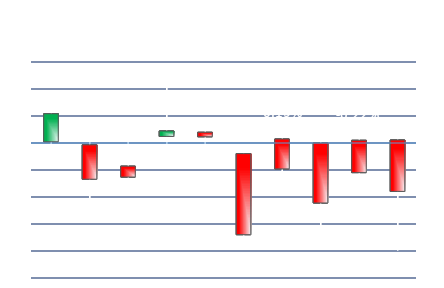
| Category | Series 0 | Series 1 | Series 2 | Series 3 |
|---|---|---|---|---|
| DXEZ19 | 0 | 0.004 | -0.001 | 0.002 |
| EU6Z19 | 0 | 0.001 | -0.005 | -0.003 |
| JY6Z19 | -0.002 | 0.001 | -0.003 | -0.003 |
| BP6Z19 | 0 | 0.005 | -0.001 | 0.001 |
| CA6Z19 | 0.001 | 0.002 | -0.001 | 0 |
| SF6Z19 | -0.001 | 0 | -0.008 | -0.007 |
| DA6Z19 | 0 | 0.001 | -0.003 | -0.002 |
| NE6Z19 | 0 | 0.001 | -0.007 | -0.004 |
| MX6Z19 | 0 | 0.001 | -0.003 | -0.002 |
| EBZ19 | 0 | 0 | -0.008 | -0.004 |